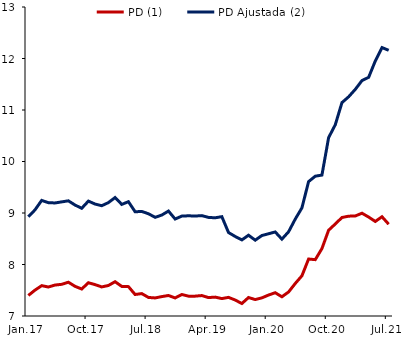
| Category | PD (1) | PD Ajustada (2) |
|---|---|---|
| 2017-01-01 | 7.399 | 8.926 |
| 2017-02-01 | 7.503 | 9.061 |
| 2017-03-01 | 7.589 | 9.245 |
| 2017-04-01 | 7.563 | 9.2 |
| 2017-05-01 | 7.601 | 9.195 |
| 2017-06-01 | 7.615 | 9.216 |
| 2017-07-01 | 7.656 | 9.237 |
| 2017-08-01 | 7.576 | 9.154 |
| 2017-09-01 | 7.524 | 9.091 |
| 2017-10-01 | 7.646 | 9.231 |
| 2017-11-01 | 7.609 | 9.174 |
| 2017-12-01 | 7.565 | 9.142 |
| 2018-01-01 | 7.593 | 9.202 |
| 2018-02-01 | 7.666 | 9.3 |
| 2018-03-01 | 7.575 | 9.167 |
| 2018-04-01 | 7.57 | 9.219 |
| 2018-05-01 | 7.418 | 9.024 |
| 2018-06-01 | 7.435 | 9.03 |
| 2018-07-01 | 7.36 | 8.985 |
| 2018-08-01 | 7.351 | 8.916 |
| 2018-09-01 | 7.377 | 8.96 |
| 2018-10-01 | 7.398 | 9.038 |
| 2018-11-01 | 7.351 | 8.883 |
| 2018-12-01 | 7.418 | 8.94 |
| 2019-01-01 | 7.385 | 8.946 |
| 2019-02-01 | 7.386 | 8.941 |
| 2019-03-01 | 7.397 | 8.949 |
| 2019-04-01 | 7.358 | 8.915 |
| 2019-05-01 | 7.367 | 8.907 |
| 2019-06-01 | 7.338 | 8.929 |
| 2019-07-01 | 7.362 | 8.621 |
| 2019-08-01 | 7.31 | 8.544 |
| 2019-09-01 | 7.242 | 8.477 |
| 2019-10-01 | 7.359 | 8.569 |
| 2019-11-01 | 7.319 | 8.472 |
| 2019-12-01 | 7.352 | 8.563 |
| 2020-01-01 | 7.407 | 8.597 |
| 2020-02-01 | 7.452 | 8.632 |
| 2020-03-01 | 7.373 | 8.492 |
| 2020-04-01 | 7.467 | 8.635 |
| 2020-05-01 | 7.631 | 8.881 |
| 2020-06-01 | 7.781 | 9.1 |
| 2020-07-01 | 8.106 | 9.61 |
| 2020-08-01 | 8.094 | 9.715 |
| 2020-09-01 | 8.309 | 9.737 |
| 2020-10-01 | 8.665 | 10.463 |
| 2020-11-01 | 8.787 | 10.714 |
| 2020-12-01 | 8.912 | 11.143 |
| 2021-01-01 | 8.938 | 11.257 |
| 2021-02-01 | 8.943 | 11.401 |
| 2021-03-01 | 8.996 | 11.571 |
| 2021-04-01 | 8.921 | 11.635 |
| 2021-05-01 | 8.836 | 11.953 |
| 2021-06-01 | 8.927 | 12.213 |
| 2021-07-01 | 8.783 | 12.159 |